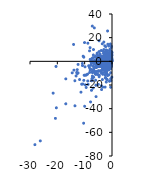
| Category | Crecimiento acumulado |
|---|---|
| -1.5 | 4.1 |
| -0.8 | -2.2 |
| -10.0 | -38 |
| -10.83786 | -1.829 |
| -1.933066 | 8.317 |
| -5.400035 | -10.8 |
| -0.1999996 | -0.9 |
| -1.2 | 0.4 |
| -2.102489 | -3.002 |
| -4.400001 | -4.4 |
| -3.450099 | -2.459 |
| -5.838281 | -29.822 |
| -0.9617063 | 5.282 |
| -5.050494 | 1.048 |
| -4.403912 | -1.87 |
| -10.66595 | -19.194 |
| -1.300085 | -4.6 |
| -3.400092 | 3.7 |
| -5.743759 | -8.892 |
| -6.95127 | 0.194 |
| -1.956653 | -8.964 |
| -2.845195 | 2.681 |
| -3.385443 | -4.174 |
| -0.4735954 | 5.872 |
| -1.113081 | 1.539 |
| -0.3622035 | 4.215 |
| -0.3629686 | 5.092 |
| -0.0994698 | 1.808 |
| -3.799078 | -1.87 |
| -1.135605 | -0.46 |
| -14.56647 | -9.763 |
| -2.899998 | 3.4 |
| -4.181784 | -8.007 |
| -1.264757 | -0.382 |
| -2.323901 | -6.499 |
| -8.834827 | 15.322 |
| -0.3673095 | 7.098 |
| -0.929783 | -0.446 |
| -1.222435 | 4.729 |
| -5.910008 | -20.217 |
| -1.899995 | -6.8 |
| -3.299995 | -7.2 |
| -2.367339 | -1.576 |
| -4.032258 | -3.777 |
| -0.0360685 | 0.171 |
| -1.327627 | 4.326 |
| -0.2792837 | 0.316 |
| -0.9618731 | 2.265 |
| -2.618646 | -0.117 |
| -0.6349207 | 8.63 |
| -0.5813953 | 3.512 |
| -7.550775 | -1.475 |
| -1.418726 | 5.856 |
| -7.539253 | -3.169 |
| -1.99999 | -1.6 |
| -2.074413 | 1.353 |
| -2.849036 | 6.127 |
| -3.938738 | -7.981 |
| -0.2083533 | 3.818 |
| -0.7857022 | 6.244 |
| -7.652528 | 0.911 |
| -4.399844 | -3.804 |
| -3.400023 | 1.907 |
| -4.168469 | -3.137 |
| -0.4669132 | 4.198 |
| -0.2359781 | 7.336 |
| -0.5 | -9.6 |
| -5.646222 | 0.392 |
| -5.011936 | -4.357 |
| -21.53334 | -26.87 |
| -1.006466 | -1.653 |
| -1.2 | 0.4 |
| -0.2363366 | 5.559 |
| -0.6029275 | 8.467 |
| -10.78932 | -3.61 |
| -0.8324614 | 0.178 |
| -6.82548 | 5.338 |
| -1.054017 | 2.661 |
| -6.23634 | -10.066 |
| -16.90778 | -14.827 |
| -4.976821 | 4.688 |
| -1.254671 | 0.216 |
| -8.215659 | 8.856 |
| -2.152696 | -10.017 |
| -3.020298 | -0.454 |
| -2.120219 | -1.266 |
| -2.711472 | 0.663 |
| -2.995342 | 9.959 |
| -3.571762 | -9.599 |
| -2.120112 | -1.425 |
| -1.665471 | -1.596 |
| -7.785601 | -0.091 |
| -1.669853 | -1.274 |
| -6.833755 | -4.202 |
| -0.4942533 | -21.923 |
| -2.074035 | 3.42 |
| -0.7749695 | 1.34 |
| -0.6828502 | -1.563 |
| -1.213167 | -6.778 |
| -12.91017 | -9.392 |
| -13.58796 | -16.39 |
| -0.7090947 | 3.76 |
| -1.033022 | 4.707 |
| -2.678449 | 5.322 |
| -4.204015 | -1.279 |
| -3.180677 | 1.914 |
| -5.398378 | 3.133 |
| -5.276682 | -1.667 |
| -1.340394 | 2.875 |
| -0.2394602 | 3.99 |
| -3.280843 | -3.411 |
| -0.9796832 | -6.473 |
| -0.6248121 | 3.113 |
| -2.582199 | 4.994 |
| -1.582223 | 3.99 |
| -0.9345794 | 7.084 |
| -2.248876 | -9.611 |
| -0.952381 | 3.855 |
| -2.5 | -4.5 |
| -0.5 | 0.64 |
| -1.09 | -1.05 |
| -0.25 | 12.736 |
| -2.0684 | -1.947 |
| -1.667642 | -3.027 |
| -4.38726 | 6.287 |
| -1.004699 | 0.947 |
| -1.030183 | -3.038 |
| -7.498549 | -24.498 |
| -0.860283 | 3.318 |
| -7.383633 | -9.085 |
| -16.91057 | -35.893 |
| -2.042614 | -0.652 |
| -2.384591 | -7.741 |
| -2.429304 | -14.041 |
| -0.6742712 | -0.99 |
| -4.841785 | -2.547 |
| -0.9003067 | -1.428 |
| -0.923761 | -1.585 |
| -0.4425466 | -1.1 |
| -0.0158353 | 0.634 |
| -0.7134491 | -5.802 |
| -0.6540618 | -1.141 |
| -3.544668 | 14.83 |
| -12.71662 | -7.017 |
| -0.2006224 | -1.389 |
| -2.599284 | 3.236 |
| -4.277593 | -4.267 |
| -6.655203 | -7.597 |
| -2.122535 | 1.399 |
| -5.454318 | -4.509 |
| -0.2516747 | 1.052 |
| -0.3937008 | 2.373 |
| -0.3584229 | 5.757 |
| -4.846939 | -3.775 |
| -1.90815 | -10.534 |
| -3.133046 | -1.768 |
| -2.420382 | 2.018 |
| -1.338199 | -3.064 |
| -4.72973 | 8.273 |
| -8.193668 | -9.411 |
| -4.924242 | -7.912 |
| -1.128881 | 6.113 |
| -2.304894 | -13.718 |
| -0.4572629 | 2.144 |
| -7.217896 | -16.125 |
| -4.185226 | 2.108 |
| -2.098517 | 9.631 |
| -1.370977 | -7.287 |
| -8.269036 | -5.277 |
| -1.426189 | -2.547 |
| -0.2784651 | 3.965 |
| -0.6126528 | 1.733 |
| -2.941341 | -0.976 |
| -20.69999 | -48.2 |
| -2.1 | -17.5 |
| -3.086776 | 0.86 |
| -8.943175 | -10.826 |
| -0.786428 | -2.695 |
| -2.279145 | 3.991 |
| -1.392758 | 4.963 |
| -0.7712082 | 10.11 |
| -0.7900677 | 3.305 |
| -3.184713 | 3.394 |
| -1.149425 | 0.013 |
| -4.166667 | 1.63 |
| -0.4347826 | -0.435 |
| -0.7881356 | 0.766 |
| -0.9791992 | 1.548 |
| -0.7333342 | -0.03 |
| -5.565278 | -1.62 |
| -2.916379 | -0.064 |
| -11.85992 | -15.399 |
| -2.511031 | -2.058 |
| -5.037541 | -8.495 |
| -3.635031 | 2.439 |
| -1.553721 | -2.686 |
| -2.258863 | 2.029 |
| -1.6 | 0.4 |
| -0.4443037 | -4.839 |
| -3.502825 | -6.079 |
| -0.5980861 | -0.478 |
| -3.35307 | 3.443 |
| -1.207861 | 1.394 |
| -0.2801923 | 1.656 |
| -7.201297 | 29.794 |
| -1.52389 | 14.456 |
| -0.4975118 | 3.702 |
| -3.4 | 2.1 |
| -0.9999986 | 4.6 |
| -20.48648 | -4.339 |
| -0.199338 | 1.99 |
| -0.9854139 | -0.417 |
| -1.798001 | -0.978 |
| -2.797277 | -4.297 |
| -0.4323401 | 0.127 |
| -1.130717 | -1.57 |
| -2.251243 | -7.173 |
| -1.044374 | -1.296 |
| -3.522888 | -1.718 |
| -5.497792 | 0.026 |
| -0.1347709 | -3.137 |
| -1.391221 | -2.316 |
| -1.303258 | 2.777 |
| -1.889535 | 5.402 |
| -2.432 | 1.299 |
| -5.882643 | -3.376 |
| -2.459114 | 4.308 |
| -0.2530675 | 1.282 |
| -0.0652631 | 0.671 |
| -3.49666 | -15.389 |
| -6.551031 | -5.762 |
| -1.477944 | 0.047 |
| -2.151167 | 1.978 |
| -0.0897692 | 0.169 |
| -0.2238066 | -3.598 |
| -4.681171 | -8.27 |
| -0.716092 | 2.875 |
| -2.611039 | 0.973 |
| -2.208835 | 1.282 |
| -13.14031 | -12.371 |
| -3.33672 | -21.782 |
| -9.345724 | -11.528 |
| -1.471012 | -3.169 |
| -6.6087 | -8.52 |
| -5.159778 | -3.81 |
| -0.729443 | 2.475 |
| -2.162374 | -7.801 |
| -0.0682748 | 1.109 |
| -2.651701 | 3.927 |
| -0.88813 | 1.264 |
| -1.049845 | -6.531 |
| -2.770388 | -4.469 |
| -1.225203 | 1.866 |
| -2.003148 | -2.202 |
| -1.041636 | -6.569 |
| -0.4542629 | 1.288 |
| -0.1010693 | -0.101 |
| -1.827676 | -15.392 |
| -7.964602 | 1.651 |
| -4.718693 | 17.377 |
| -0.5847953 | 0.003 |
| -2.092141 | 5.088 |
| -5.471192 | 5.837 |
| -2.882325 | -9.407 |
| -20.36067 | -39.282 |
| -4.257685 | 4.308 |
| -10.04961 | 15.846 |
| -26.22889 | -67.237 |
| -1.788597 | 2.902 |
| -7.076103 | -9.447 |
| -2.599993 | -0.21 |
| -6.773254 | 9.956 |
| -28.20889 | -70.404 |
| -0.8 | 0.3 |
| -6.460419 | -2.083 |
| -5.275305 | 3.832 |
| -3.808821 | -23.849 |
| -4.709414 | -13.015 |
| -11.35251 | -26.055 |
| -2.712274 | -6.475 |
| -12.39689 | -9.764 |
| -0.6070792 | -0.984 |
| -1.763929 | -2.723 |
| -0.790063 | 4.233 |
| -13.55204 | -37.584 |
| -1.528264 | 4.268 |
| -0.8426212 | -6.221 |
| -0.7185569 | 3.712 |
| -3.209308 | -5.228 |
| -3.986668 | -1.605 |
| -2.469971 | 7.453 |
| -9.8 | -11.7 |
| -6.306352 | -5.125 |
| -0.0421013 | 1.636 |
| -12.40797 | -2.623 |
| -4.72626 | -4.463 |
| -5.244964 | -2.729 |
| -0.2147997 | 1.41 |
| -7.332981 | 2.359 |
| -10.31315 | 3.516 |
| -4.075689 | -2.315 |
| -1.265823 | 0.016 |
| -7.444169 | -1.278 |
| -1.5625 | 5.898 |
| -7.988981 | -7.39 |
| -1.388889 | 0.02 |
| -4.048789 | 2.847 |
| -8.022408 | 11.554 |
| -1.753702 | 4.838 |
| -4.769891 | 1.371 |
| -4.629436 | -11.814 |
| -1.818226 | -2.744 |
| -3.202516 | -6.577 |
| -0.3238631 | 11.614 |
| -3.23497 | 0.598 |
| -3.275221 | 8.58 |
| -0.9911495 | -0.236 |
| -2.477377 | 1.071 |
| -1.626016 | 25.647 |
| -0.8438818 | -5.525 |
| -5.15873 | 3.209 |
| -1.930502 | -2.324 |
| -2.120141 | 1.49 |
| -3.135889 | -0.258 |
| -1.823708 | 0.034 |
| -3.107345 | 6.805 |
| -4.010025 | -1.138 |
| -0.4716981 | 1.661 |
| -1.070336 | 3.721 |
| -0.5208128 | -4.007 |
| -3.078955 | -1.357 |
| -5.758682 | 0.116 |
| -0.6054924 | -0.474 |
| -4.700336 | 0.41 |
| -2.485634 | -11.684 |
| -2.069481 | 5.244 |
| -2.764603 | 6.854 |
| -0.5571682 | 3.78 |
| -2.544145 | 7.87 |
| -2.097739 | -2.838 |
| -5.405448 | 6.967 |
| -1.560702 | 5.678 |
| -0.1799422 | 0.894 |
| -6.9 | -22.6 |
| -2.3 | 12.4 |
| -6.946418 | 3.174 |
| -0.9568424 | 1.643 |
| -1.057421 | -5.063 |
| -0.6493635 | 9.011 |
| -10.16889 | -11.79 |
| -1.619904 | 1.385 |
| -0.1010887 | 5.002 |
| -0.5138766 | -1.797 |
| -3.772684 | -2.372 |
| -1.056668 | -1.551 |
| -0.5715078 | -2.725 |
| -3.303044 | -1.624 |
| -0.1241202 | 6.734 |
| -2.129426 | -1.255 |
| -0.8312261 | -0.373 |
| -0.1552313 | 5.057 |
| -7.844874 | -34.322 |
| -0.8168246 | 3.798 |
| -1.565665 | -5.649 |
| -0.4 | 4.6 |
| -2.75921 | 0.432 |
| -3.401563 | -10.967 |
| -0.1776801 | 1.997 |
| -3.863643 | -20.683 |
| -1.308459 | 1.181 |
| -6.516446 | -5.067 |
| -6.611233 | -1.522 |
| -2.583632 | 5.457 |
| -0.8253764 | 7.59 |
| -0.7118124 | 7.648 |
| -6.709439 | -13.434 |
| -1.053188 | -6.104 |
| -8.754176 | -19.506 |
| -4.825068 | -0.4 |
| -0.2553328 | 0.783 |
| -1.622536 | -1.021 |
| -14.06086 | 14.266 |
| -2.3612 | -8.766 |
| -3.992226 | 1.253 |
| -1.100585 | -3.767 |
| -4.524362 | -1.851 |
| -1.849837 | -15.264 |
| -1.620029 | -5.911 |
| -2.317721 | -1.169 |
| -0.9834996 | 2.594 |
| -1.42369 | -4.419 |
| -3.446136 | 3.152 |
| -6.343363 | -1.662 |
| -2.454582 | -2.5 |
| -1.397618 | -4.44 |
| -1.36608 | -3.68 |
| -3.965691 | 9.127 |
| -1.238968 | 12.986 |
| -9.452736 | -22.09 |
| -0.6451613 | 4.55 |
| -0.4672897 | 0.941 |
| -7.323684 | -14.63 |
| -0.5783179 | -0.241 |
| -0.5767139 | 2.505 |
| -6.000013 | -16 |
| -0.3660276 | 3.496 |
| -7.170856 | -14.176 |
| -4.348354 | 2.543 |
| -1.041881 | 0.595 |
| -0.6873243 | 0.802 |
| -0.9342411 | 0.877 |
| -2.978074 | -1.079 |
| -1.826857 | -5.855 |
| -0.1 | 2.3 |
| -0.5 | -6.3 |
| -6.053089 | -10.871 |
| -7.066833 | -7.865 |
| -5.0 | -19.5 |
| -5.344864 | 1.006 |
| -7.8 | -3.3 |
| -3.575847 | -1.103 |
| -2.468354 | 3.567 |
| -0.2951304 | 0.001 |
| -5.705853 | -5.287 |
| -4.3 | 2.3 |
| -10.37808 | -52.268 |
| -1.081359 | -11.395 |
| -3.873971 | -9.904 |
| -5.832119 | -8.762 |
| -2.152646 | -0.952 |
| -11.09816 | -19.315 |
| -3.760054 | 4.464 |
| -0.7484856 | 4.116 |
| -0.1211395 | 6.311 |
| -5.625191 | -2.323 |
| -6.244799 | 3.393 |
| -3.316771 | 1.753 |
| -5.326393 | -1.581 |
| -0.592431 | 3.385 |
| -0.6756381 | 1.88 |
| -0.0173286 | 5.346 |
| -2.2567 | -6.133 |
| -2.436569 | -1.952 |
| -2.271163 | -1.058 |
| -5.887128 | -8.738 |
| -2.140515 | -3.248 |
| -1.062273 | 2.004 |
| -3.03765 | -1.593 |
| -0.5606294 | 1.318 |
| -1.575768 | 0.124 |
| -6.740417 | -6.608 |
| -0.9250147 | -16.812 |
| -3.419882 | -6.651 |
| -6.462625 | 28.259 |
| -0.687041 | 0.641 |
| -2.22523 | 3.87 |
| -0.9522901 | 3.259 |
| -0.6033883 | 14.637 |
| -0.3998824 | -16.3 |
| -0.2017981 | 1.012 |
| -5.290131 | -0.463 |
| -1.004603 | 0.947 |
| -1.030098 | -3.038 |
| -7.498806 | -16.399 |
| -7.797361 | -6.56 |
| -2.718169 | -3.776 |
| -10.55556 | 4.351 |
| -2.788845 | -4.586 |
| -3.132323 | -3.334 |
| -0.9140768 | 0.377 |
| -0.4857317 | -14.763 |
| -4.738347 | 2.151 |
| -0.3833908 | -2.23 |
| -1.211484 | -1.194 |
| -0.3177857 | -1.336 |
| -1.538101 | 1.502 |
| -0.4078582 | 0.831 |
| -1.313657 | 1.021 |
| -3.575491 | -3.558 |
| -0.6199239 | -2.71 |
| -0.0606522 | 7.773 |
| -3.134953 | 4.342 |
| -1.544978 | -1.25 |
| -2.870813 | -4.102 |
| -3.504673 | -2.052 |
| -5.117271 | -4.443 |
| -5.865922 | -10.91 |
| -5.033113 | -11.309 |
| -0.3708282 | 8.562 |
| -5.46697 | 2.123 |
| -1.818182 | -4.04 |
| -0.2659574 | -4.088 |
| -1.547031 | 0.484 |
| -1.026845 | -2.002 |
| -0.557043 | -5.742 |
| -0.2863409 | 0.996 |
| -6.711838 | -7.551 |
| -1.476154 | -0.779 |
| -0.9349999 | -1.068 |
| -2.122083 | 0.767 |
| -2.978681 | 16.272 |
| -1.400123 | 6.9 |
| -6.498145 | 0.798 |
| -4.756893 | -3.506 |
| -6.06702 | 4.291 |
| -1.09019 | 4.463 |
| -3.121053 | -0.826 |
| -2.036762 | 4.866 |
| -8.556003 | -3.758 |
| -1.259919 | 4.315 |
| -1.566612 | 9.064 |
| -1.602564 | -12.026 |
| -2.293578 | 5.688 |
| -4.169316 | 0.084 |
| -0.6211848 | -1.09 |
| -3.419027 | -7.127 |
| -2.483971 | 7.616 |
| -0.5903188 | -3.797 |
| -3.870968 | -0.068 |
| -2.262931 | 0.273 |
| -0.9677419 | -2.271 |
| -4.243775 | 3.568 |
| -10.31237 | -16.064 |
| -1.647221 | -3.101 |
| -4.390593 | -4.483 |
| -0.4818356 | 4.192 |
| -1.453302 | 5.248 |
| -1.918843 | 1.826 |
| -0.8683038 | -1.647 |
| -5.455995 | 1.734 |
| -3.365346 | 3.409 |
| -5.697475 | 0.466 |
| -4.825875 | 4.331 |
| -0.3460208 | -3.703 |
| -4.381916 | 2.891 |
| -1.779661 | 6.244 |
| -7.188498 | -12.438 |
| -2.52174 | -21.79 |
| -2.623295 | 13.109 |
| -0.0285677 | 7.334 |
| -5.242922 | -3.607 |
| -1.69855 | -2.395 |
| -2.195771 | -3.043 |
| -1.236319 | -0.789 |
| -0.3320443 | -4.643 |
| -0.5911348 | -0.947 |
| -0.2285162 | 2.366 |
| -1.911148 | 2.722 |
| -0.0737016 | 3.481 |
| -0.2916211 | -3.067 |
| -1.492537 | -1.493 |
| -3.791469 | -1.821 |
| -0.4444444 | -1.784 |
| -9.771987 | -19.88 |
| -1.347709 | 4.117 |
| -2.054795 | -3.92 |
| -1.902843 | -3.191 |
| -9.85553 | -4.633 |
| -13.91971 | -7.452 |
| -2.349332 | 1.602 |
| -0.1979286 | 6.173 |
| -5.970458 | -2.284 |
| -8.855647 | -16.611 |
| -3.202303 | -4.691 |
| -4.0 | -4 |
| -12.7149 | -10.322 |
| -0.1886902 | -0.189 |
| -0.9620253 | 5.781 |
| -2.429235 | 1.882 |
| -4.338823 | -3.765 |
| -3.043346 | 0.811 |
| -2.911638 | -4.056 |
| -3.658145 | -4.237 |
| -0.0773395 | -13.386 |
| -0.3857463 | 4.264 |